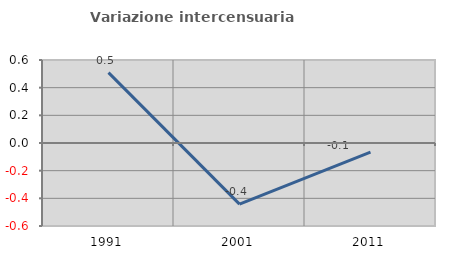
| Category | Variazione intercensuaria annua |
|---|---|
| 1991.0 | 0.509 |
| 2001.0 | -0.442 |
| 2011.0 | -0.067 |